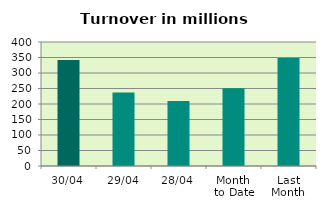
| Category | Series 0 |
|---|---|
| 30/04 | 342.16 |
| 29/04 | 237.482 |
| 28/04 | 209.926 |
| Month 
to Date | 250.745 |
| Last
Month | 348.012 |